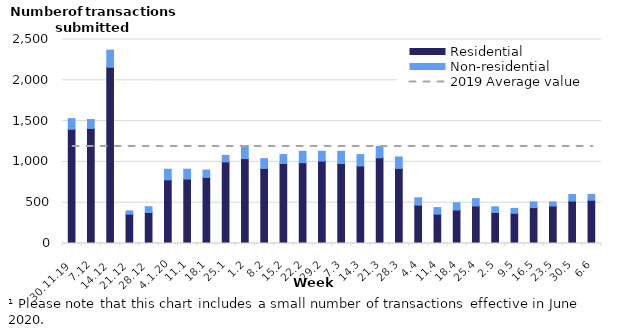
| Category | Residential | Non-residential |
|---|---|---|
| 2019-11-30 | 1400 | 130 |
| 2019-12-07 | 1410 | 110 |
| 2019-12-14 | 2160 | 210 |
| 2019-12-21 | 360 | 40 |
| 2019-12-28 | 380 | 70 |
| 2020-01-04 | 780 | 130 |
| 2020-01-11 | 790 | 120 |
| 2020-01-18 | 810 | 90 |
| 2020-01-25 | 1000 | 80 |
| 2020-02-01 | 1040 | 160 |
| 2020-02-08 | 920 | 120 |
| 2020-02-15 | 980 | 110 |
| 2020-02-22 | 990 | 140 |
| 2020-02-29 | 1010 | 120 |
| 2020-03-07 | 980 | 150 |
| 2020-03-14 | 950 | 140 |
| 2020-03-21 | 1050 | 140 |
| 2020-03-28 | 920 | 140 |
| 2020-04-04 | 470 | 90 |
| 2020-04-11 | 360 | 80 |
| 2020-04-18 | 410 | 90 |
| 2020-04-25 | 460 | 90 |
| 2020-05-02 | 380 | 70 |
| 2020-05-09 | 370 | 60 |
| 2020-05-16 | 440 | 70 |
| 2020-05-23 | 460 | 50 |
| 2020-05-30 | 520 | 80 |
| 2020-06-06 | 530 | 70 |